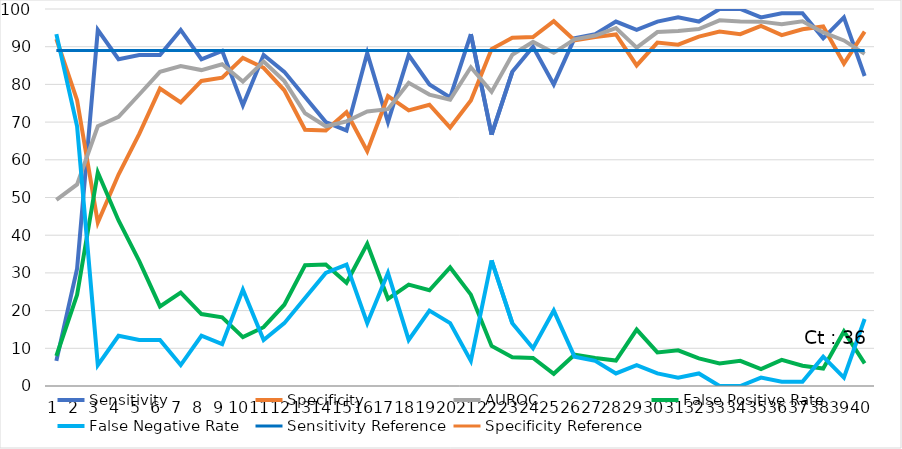
| Category | Sensitivity | Specificity | AUROC | False Positive Rate | False Negative Rate | Sensitivity Reference | Specificity Reference |
|---|---|---|---|---|---|---|---|
| 0 | 6.67 | 92.04 | 49.35 | 7.96 | 93.33 | 89 |  |
| 1 | 31.11 | 75.81 | 53.46 | 24.19 | 68.89 | 89 |  |
| 2 | 94.44 | 43.37 | 68.91 | 56.63 | 5.56 | 89 |  |
| 3 | 86.67 | 56.09 | 71.38 | 43.91 | 13.33 | 89 |  |
| 4 | 87.78 | 66.86 | 77.32 | 33.14 | 12.22 | 89 |  |
| 5 | 87.78 | 78.9 | 83.34 | 21.1 | 12.22 | 89 |  |
| 6 | 94.44 | 75.24 | 84.84 | 24.76 | 5.56 | 89 |  |
| 7 | 86.67 | 80.92 | 83.8 | 19.08 | 13.33 | 89 |  |
| 8 | 88.89 | 81.78 | 85.33 | 18.22 | 11.11 | 89 |  |
| 9 | 74.44 | 87.03 | 80.74 | 12.97 | 25.56 | 89 |  |
| 10 | 87.78 | 84.4 | 86.09 | 15.6 | 12.22 | 89 |  |
| 11 | 83.33 | 78.44 | 80.89 | 21.56 | 16.67 | 89 |  |
| 12 | 76.67 | 67.99 | 72.33 | 32.01 | 23.33 | 89 |  |
| 13 | 70 | 67.78 | 68.89 | 32.22 | 30 | 89 |  |
| 14 | 67.78 | 72.61 | 70.19 | 27.39 | 32.22 | 89 |  |
| 15 | 88.33 | 62.31 | 72.82 | 37.69 | 16.67 | 89 |  |
| 16 | 70 | 76.87 | 73.44 | 23.13 | 30 | 89 |  |
| 17 | 87.78 | 73.11 | 80.44 | 26.89 | 12.22 | 89 |  |
| 18 | 80 | 74.6 | 77.3 | 25.4 | 20 | 89 |  |
| 19 | 76.53 | 68.56 | 75.95 | 31.44 | 16.67 | 89 |  |
| 20 | 93.33 | 75.72 | 84.55 | 24.23 | 6.67 | 89 |  |
| 21 | 66.67 | 89.38 | 78.02 | 10.62 | 33.33 | 89 |  |
| 22 | 83.33 | 92.4 | 87.87 | 7.6 | 16.67 | 89 |  |
| 23 | 90 | 92.54 | 91.27 | 7.46 | 10 | 89 |  |
| 24 | 80 | 96.77 | 88.38 | 3.23 | 20 | 89 |  |
| 25 | 92.22 | 91.69 | 91.95 | 8.31 | 7.78 | 89 |  |
| 26 | 93.33 | 92.58 | 92.95 | 7.42 | 6.67 | 89 |  |
| 27 | 96.67 | 93.25 | 94.96 | 6.75 | 3.33 | 89 |  |
| 28 | 94.44 | 85.04 | 89.74 | 14.96 | 5.56 | 89 |  |
| 29 | 96.67 | 91.08 | 93.88 | 8.92 | 3.33 | 89 |  |
| 30 | 97.78 | 90.55 | 94.16 | 9.45 | 2.22 | 89 |  |
| 31 | 96.67 | 92.68 | 94.67 | 7.32 | 3.33 | 89 |  |
| 32 | 100 | 94 | 97 | 6 | 0 | 89 |  |
| 33 | 100 | 93.32 | 96.66 | 6.68 | 0 | 89 |  |
| 34 | 97.78 | 95.52 | 96.65 | 4.48 | 2.22 | 89 |  |
| 35 | 98.89 | 93.07 | 95.98 | 6.93 | 1.11 | 89 |  |
| 36 | 98.89 | 94.64 | 96.76 | 5.36 | 1.11 | 89 |  |
| 37 | 92.22 | 95.35 | 93.78 | 4.65 | 7.78 | 89 |  |
| 38 | 97.78 | 85.54 | 91.66 | 14.46 | 2.22 | 89 |  |
| 39 | 82.22 | 94 | 88.11 | 6 | 17.78 | 89 |  |